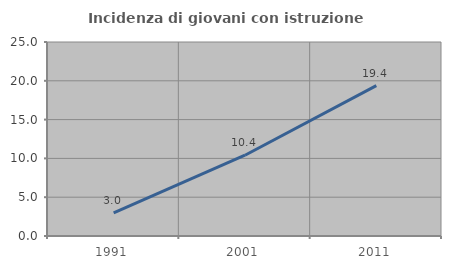
| Category | Incidenza di giovani con istruzione universitaria |
|---|---|
| 1991.0 | 2.992 |
| 2001.0 | 10.408 |
| 2011.0 | 19.388 |